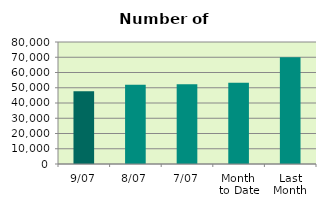
| Category | Series 0 |
|---|---|
| 9/07 | 47630 |
| 8/07 | 51938 |
| 7/07 | 52228 |
| Month 
to Date | 53258.857 |
| Last
Month | 70062.455 |